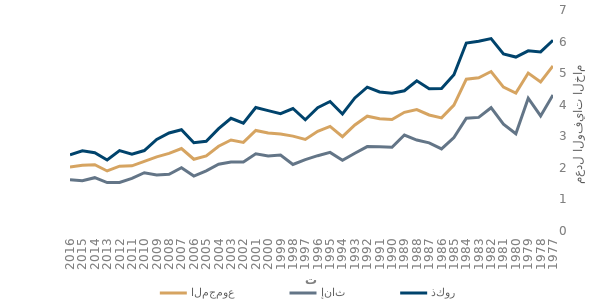
| Category | المجموع | إناث | ذكور |
|---|---|---|---|
| 1977.0 | 5.23 | 4.311 | 6.04 |
| 1978.0 | 4.721 | 3.644 | 5.674 |
| 1979.0 | 5.002 | 4.207 | 5.708 |
| 1980.0 | 4.366 | 3.082 | 5.509 |
| 1981.0 | 4.556 | 3.386 | 5.609 |
| 1982.0 | 5.052 | 3.905 | 6.094 |
| 1983.0 | 4.855 | 3.599 | 6.01 |
| 1984.0 | 4.808 | 3.575 | 5.953 |
| 1985.0 | 3.987 | 2.96 | 4.951 |
| 1986.0 | 3.584 | 2.598 | 4.511 |
| 1987.0 | 3.674 | 2.793 | 4.506 |
| 1988.0 | 3.846 | 2.88 | 4.76 |
| 1989.0 | 3.76 | 3.041 | 4.442 |
| 1990.0 | 3.531 | 2.654 | 4.364 |
| 1991.0 | 3.557 | 2.668 | 4.405 |
| 1992.0 | 3.637 | 2.674 | 4.556 |
| 1993.0 | 3.358 | 2.465 | 4.214 |
| 1994.0 | 2.987 | 2.24 | 3.705 |
| 1995.0 | 3.311 | 2.49 | 4.102 |
| 1996.0 | 3.159 | 2.385 | 3.906 |
| 1997.0 | 2.901 | 2.259 | 3.523 |
| 1998.0 | 3.005 | 2.107 | 3.88 |
| 1999.0 | 3.071 | 2.409 | 3.719 |
| 2000.0 | 3.102 | 2.377 | 3.813 |
| 2001.0 | 3.184 | 2.446 | 3.913 |
| 2002.0 | 2.808 | 2.189 | 3.417 |
| 2003.0 | 2.883 | 2.184 | 3.57 |
| 2004.0 | 2.684 | 2.115 | 3.242 |
| 2005.0 | 2.378 | 1.906 | 2.841 |
| 2006.0 | 2.273 | 1.741 | 2.795 |
| 2007.0 | 2.612 | 2.004 | 3.209 |
| 2008.0 | 2.457 | 1.796 | 3.106 |
| 2009.0 | 2.347 | 1.776 | 2.9 |
| 2010.0 | 2.206 | 1.845 | 2.548 |
| 2011.0 | 2.063 | 1.668 | 2.436 |
| 2012.0 | 2.054 | 1.535 | 2.545 |
| 2013.0 | 1.901 | 1.533 | 2.248 |
| 2014.0 | 2.099 | 1.689 | 2.477 |
| 2015.0 | 2.081 | 1.595 | 2.54 |
| 2016.0 | 2.031 | 1.625 | 2.417 |